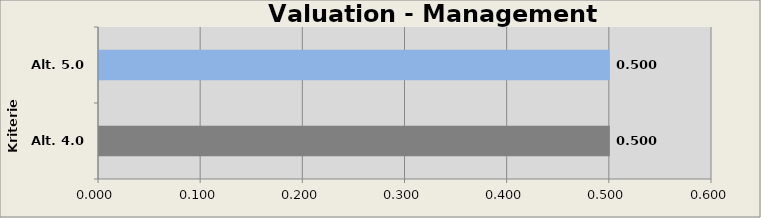
| Category | Valuation Management Module  |
|---|---|
| Alt. 4.0 m | 0.5 |
| Alt. 5.0 m | 0.5 |